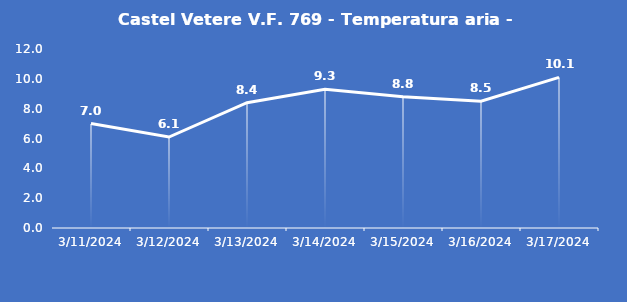
| Category | Castel Vetere V.F. 769 - Temperatura aria - Grezzo (°C) |
|---|---|
| 3/11/24 | 7 |
| 3/12/24 | 6.1 |
| 3/13/24 | 8.4 |
| 3/14/24 | 9.3 |
| 3/15/24 | 8.8 |
| 3/16/24 | 8.5 |
| 3/17/24 | 10.1 |